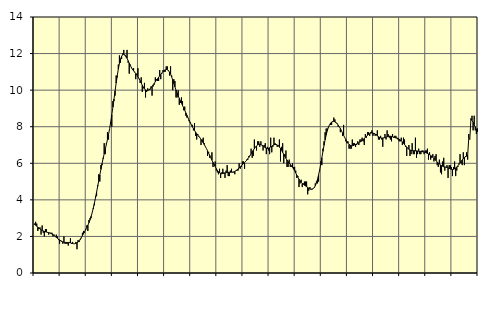
| Category | Piggar | Series 1 |
|---|---|---|
| nan | 2.7 | 2.65 |
| 87.0 | 2.8 | 2.61 |
| 87.0 | 2.7 | 2.56 |
| 87.0 | 2.3 | 2.51 |
| 87.0 | 2.4 | 2.46 |
| 87.0 | 2.5 | 2.41 |
| 87.0 | 2.1 | 2.36 |
| 87.0 | 2.6 | 2.33 |
| 87.0 | 2.2 | 2.3 |
| 87.0 | 2 | 2.27 |
| 87.0 | 2.4 | 2.25 |
| 87.0 | 2.4 | 2.24 |
| nan | 2.2 | 2.22 |
| 88.0 | 2.1 | 2.21 |
| 88.0 | 2.2 | 2.19 |
| 88.0 | 2.2 | 2.16 |
| 88.0 | 2.2 | 2.13 |
| 88.0 | 2 | 2.09 |
| 88.0 | 2.1 | 2.05 |
| 88.0 | 2 | 2 |
| 88.0 | 2.1 | 1.95 |
| 88.0 | 2 | 1.9 |
| 88.0 | 1.8 | 1.85 |
| 88.0 | 1.6 | 1.81 |
| nan | 1.8 | 1.76 |
| 89.0 | 1.7 | 1.73 |
| 89.0 | 1.6 | 1.7 |
| 89.0 | 2 | 1.68 |
| 89.0 | 1.6 | 1.67 |
| 89.0 | 1.6 | 1.67 |
| 89.0 | 1.6 | 1.67 |
| 89.0 | 1.5 | 1.66 |
| 89.0 | 1.7 | 1.66 |
| 89.0 | 1.9 | 1.65 |
| 89.0 | 1.6 | 1.63 |
| 89.0 | 1.7 | 1.61 |
| nan | 1.6 | 1.6 |
| 90.0 | 1.6 | 1.6 |
| 90.0 | 1.7 | 1.62 |
| 90.0 | 1.3 | 1.65 |
| 90.0 | 1.8 | 1.69 |
| 90.0 | 1.7 | 1.76 |
| 90.0 | 1.8 | 1.84 |
| 90.0 | 1.9 | 1.94 |
| 90.0 | 2.2 | 2.04 |
| 90.0 | 2.3 | 2.15 |
| 90.0 | 2.2 | 2.26 |
| 90.0 | 2.4 | 2.37 |
| nan | 2.6 | 2.49 |
| 91.0 | 2.3 | 2.61 |
| 91.0 | 2.9 | 2.75 |
| 91.0 | 3 | 2.91 |
| 91.0 | 3 | 3.1 |
| 91.0 | 3.3 | 3.31 |
| 91.0 | 3.5 | 3.55 |
| 91.0 | 3.7 | 3.82 |
| 91.0 | 4.2 | 4.11 |
| 91.0 | 4.2 | 4.42 |
| 91.0 | 4.8 | 4.73 |
| 91.0 | 5.4 | 5.05 |
| nan | 5 | 5.36 |
| 92.0 | 5.9 | 5.67 |
| 92.0 | 5.9 | 5.97 |
| 92.0 | 6.3 | 6.25 |
| 92.0 | 7.1 | 6.52 |
| 92.0 | 6.5 | 6.77 |
| 92.0 | 7.1 | 7.03 |
| 92.0 | 7.7 | 7.3 |
| 92.0 | 7.3 | 7.58 |
| 92.0 | 7.9 | 7.9 |
| 92.0 | 8.2 | 8.26 |
| 92.0 | 8 | 8.65 |
| nan | 9.4 | 9.07 |
| 93.0 | 9.4 | 9.51 |
| 93.0 | 9.7 | 9.95 |
| 93.0 | 10.8 | 10.39 |
| 93.0 | 10.7 | 10.79 |
| 93.0 | 11.4 | 11.16 |
| 93.0 | 11.9 | 11.46 |
| 93.0 | 11.5 | 11.7 |
| 93.0 | 11.7 | 11.85 |
| 93.0 | 12 | 11.94 |
| 93.0 | 12.2 | 11.96 |
| 93.0 | 11.9 | 11.93 |
| nan | 11.8 | 11.85 |
| 94.0 | 12.2 | 11.74 |
| 94.0 | 11.5 | 11.61 |
| 94.0 | 10.9 | 11.48 |
| 94.0 | 11.4 | 11.35 |
| 94.0 | 11.2 | 11.24 |
| 94.0 | 11.1 | 11.14 |
| 94.0 | 11.2 | 11.06 |
| 94.0 | 11 | 10.98 |
| 94.0 | 10.6 | 10.91 |
| 94.0 | 10.9 | 10.83 |
| 94.0 | 11.2 | 10.74 |
| nan | 10.6 | 10.63 |
| 95.0 | 10.4 | 10.52 |
| 95.0 | 10.7 | 10.39 |
| 95.0 | 9.9 | 10.27 |
| 95.0 | 10.1 | 10.17 |
| 95.0 | 10.4 | 10.08 |
| 95.0 | 9.6 | 10.01 |
| 95.0 | 9.9 | 9.98 |
| 95.0 | 10.1 | 9.98 |
| 95.0 | 10 | 10.01 |
| 95.0 | 10 | 10.06 |
| 95.0 | 10.2 | 10.13 |
| nan | 9.7 | 10.2 |
| 96.0 | 10.2 | 10.29 |
| 96.0 | 10.3 | 10.37 |
| 96.0 | 10.7 | 10.46 |
| 96.0 | 10.6 | 10.54 |
| 96.0 | 10.5 | 10.62 |
| 96.0 | 10.5 | 10.7 |
| 96.0 | 11.1 | 10.78 |
| 96.0 | 10.6 | 10.86 |
| 96.0 | 10.9 | 10.94 |
| 96.0 | 11.1 | 11.01 |
| 96.0 | 11 | 11.07 |
| nan | 11 | 11.11 |
| 97.0 | 11.3 | 11.13 |
| 97.0 | 11.3 | 11.12 |
| 97.0 | 11.1 | 11.07 |
| 97.0 | 10.8 | 10.99 |
| 97.0 | 11.3 | 10.87 |
| 97.0 | 10.8 | 10.72 |
| 97.0 | 10 | 10.55 |
| 97.0 | 10.6 | 10.37 |
| 97.0 | 10.5 | 10.18 |
| 97.0 | 9.6 | 10 |
| 97.0 | 9.6 | 9.84 |
| nan | 10 | 9.69 |
| 98.0 | 9.2 | 9.55 |
| 98.0 | 9.3 | 9.42 |
| 98.0 | 9.6 | 9.29 |
| 98.0 | 9.4 | 9.16 |
| 98.0 | 8.9 | 9.03 |
| 98.0 | 9.1 | 8.9 |
| 98.0 | 8.6 | 8.76 |
| 98.0 | 8.5 | 8.63 |
| 98.0 | 8.5 | 8.49 |
| 98.0 | 8.3 | 8.36 |
| 98.0 | 8.2 | 8.24 |
| nan | 8.1 | 8.12 |
| 99.0 | 8.1 | 8 |
| 99.0 | 7.8 | 7.9 |
| 99.0 | 8.2 | 7.8 |
| 99.0 | 7.5 | 7.7 |
| 99.0 | 7.3 | 7.62 |
| 99.0 | 7.6 | 7.54 |
| 99.0 | 7.5 | 7.46 |
| 99.0 | 7.4 | 7.39 |
| 99.0 | 7 | 7.3 |
| 99.0 | 7.3 | 7.22 |
| 99.0 | 7.4 | 7.12 |
| nan | 7.1 | 7.02 |
| 0.0 | 6.9 | 6.91 |
| 0.0 | 6.8 | 6.8 |
| 0.0 | 6.4 | 6.68 |
| 0.0 | 6.6 | 6.55 |
| 0.0 | 6.3 | 6.43 |
| 0.0 | 6.3 | 6.3 |
| 0.0 | 6.6 | 6.17 |
| 0.0 | 5.8 | 6.05 |
| 0.0 | 5.9 | 5.93 |
| 0.0 | 6.1 | 5.82 |
| 0.0 | 5.6 | 5.71 |
| nan | 5.5 | 5.61 |
| 1.0 | 5.4 | 5.54 |
| 1.0 | 5.7 | 5.48 |
| 1.0 | 5.2 | 5.45 |
| 1.0 | 5.5 | 5.43 |
| 1.0 | 5.7 | 5.44 |
| 1.0 | 5.5 | 5.45 |
| 1.0 | 5.2 | 5.47 |
| 1.0 | 5.6 | 5.48 |
| 1.0 | 5.9 | 5.5 |
| 1.0 | 5.3 | 5.51 |
| 1.0 | 5.3 | 5.51 |
| nan | 5.6 | 5.51 |
| 2.0 | 5.7 | 5.51 |
| 2.0 | 5.5 | 5.52 |
| 2.0 | 5.5 | 5.53 |
| 2.0 | 5.4 | 5.56 |
| 2.0 | 5.6 | 5.59 |
| 2.0 | 5.6 | 5.64 |
| 2.0 | 5.6 | 5.69 |
| 2.0 | 6 | 5.74 |
| 2.0 | 5.7 | 5.8 |
| 2.0 | 5.8 | 5.86 |
| 2.0 | 6.1 | 5.92 |
| nan | 6.1 | 5.98 |
| 3.0 | 5.7 | 6.04 |
| 3.0 | 6.1 | 6.11 |
| 3.0 | 6.2 | 6.17 |
| 3.0 | 6.2 | 6.25 |
| 3.0 | 6.4 | 6.33 |
| 3.0 | 6.4 | 6.42 |
| 3.0 | 6.8 | 6.52 |
| 3.0 | 6.3 | 6.61 |
| 3.0 | 6.4 | 6.71 |
| 3.0 | 7.3 | 6.8 |
| 3.0 | 6.9 | 6.88 |
| nan | 6.7 | 6.95 |
| 4.0 | 7.2 | 7 |
| 4.0 | 7.2 | 7.03 |
| 4.0 | 6.9 | 7.04 |
| 4.0 | 7.2 | 7.02 |
| 4.0 | 7 | 6.99 |
| 4.0 | 6.7 | 6.95 |
| 4.0 | 7 | 6.9 |
| 4.0 | 7.1 | 6.85 |
| 4.0 | 6.5 | 6.83 |
| 4.0 | 6.9 | 6.81 |
| 4.0 | 6.7 | 6.82 |
| nan | 6.5 | 6.85 |
| 5.0 | 7.4 | 6.89 |
| 5.0 | 6.6 | 6.93 |
| 5.0 | 6.9 | 6.98 |
| 5.0 | 7.4 | 7.01 |
| 5.0 | 7.1 | 7.03 |
| 5.0 | 7 | 7.03 |
| 5.0 | 6.9 | 7 |
| 5.0 | 7 | 6.96 |
| 5.0 | 7.3 | 6.89 |
| 5.0 | 6.1 | 6.81 |
| 5.0 | 6.9 | 6.71 |
| nan | 7.1 | 6.6 |
| 6.0 | 6 | 6.49 |
| 6.0 | 6.5 | 6.38 |
| 6.0 | 6.7 | 6.27 |
| 6.0 | 5.8 | 6.18 |
| 6.0 | 5.8 | 6.09 |
| 6.0 | 6.2 | 6.02 |
| 6.0 | 5.8 | 5.94 |
| 6.0 | 5.8 | 5.87 |
| 6.0 | 6 | 5.79 |
| 6.0 | 5.8 | 5.69 |
| 6.0 | 5.8 | 5.59 |
| nan | 5.6 | 5.47 |
| 7.0 | 5.2 | 5.35 |
| 7.0 | 5.3 | 5.24 |
| 7.0 | 4.7 | 5.13 |
| 7.0 | 4.9 | 5.04 |
| 7.0 | 5.1 | 4.96 |
| 7.0 | 4.7 | 4.9 |
| 7.0 | 4.9 | 4.85 |
| 7.0 | 5 | 4.8 |
| 7.0 | 5 | 4.76 |
| 7.0 | 5 | 4.72 |
| 7.0 | 4.3 | 4.68 |
| nan | 4.5 | 4.63 |
| 8.0 | 4.7 | 4.6 |
| 8.0 | 4.6 | 4.58 |
| 8.0 | 4.6 | 4.58 |
| 8.0 | 4.6 | 4.61 |
| 8.0 | 4.7 | 4.67 |
| 8.0 | 4.9 | 4.77 |
| 8.0 | 5 | 4.92 |
| 8.0 | 4.9 | 5.12 |
| 8.0 | 5 | 5.36 |
| 8.0 | 5.6 | 5.64 |
| 8.0 | 6.1 | 5.96 |
| nan | 5.9 | 6.3 |
| 9.0 | 6.8 | 6.65 |
| 9.0 | 7.2 | 6.98 |
| 9.0 | 7.7 | 7.28 |
| 9.0 | 7.9 | 7.55 |
| 9.0 | 7.9 | 7.78 |
| 9.0 | 8 | 7.96 |
| 9.0 | 8.1 | 8.1 |
| 9.0 | 8.1 | 8.19 |
| 9.0 | 8.1 | 8.26 |
| 9.0 | 8.3 | 8.29 |
| 9.0 | 8.5 | 8.29 |
| nan | 8.4 | 8.27 |
| 10.0 | 8.2 | 8.23 |
| 10.0 | 8.2 | 8.17 |
| 10.0 | 8 | 8.09 |
| 10.0 | 8 | 8 |
| 10.0 | 7.7 | 7.9 |
| 10.0 | 7.8 | 7.78 |
| 10.0 | 7.5 | 7.66 |
| 10.0 | 8.1 | 7.53 |
| 10.0 | 7.4 | 7.41 |
| 10.0 | 7.2 | 7.3 |
| 10.0 | 7.1 | 7.19 |
| nan | 7.2 | 7.1 |
| 11.0 | 6.8 | 7.03 |
| 11.0 | 6.8 | 6.99 |
| 11.0 | 6.8 | 6.96 |
| 11.0 | 7.3 | 6.96 |
| 11.0 | 7.1 | 6.97 |
| 11.0 | 7.1 | 7 |
| 11.0 | 6.9 | 7.03 |
| 11.0 | 7 | 7.06 |
| 11.0 | 7.2 | 7.09 |
| 11.0 | 7 | 7.12 |
| 11.0 | 7.3 | 7.16 |
| nan | 7.3 | 7.2 |
| 12.0 | 7.4 | 7.24 |
| 12.0 | 7.2 | 7.3 |
| 12.0 | 7 | 7.36 |
| 12.0 | 7.6 | 7.42 |
| 12.0 | 7.4 | 7.48 |
| 12.0 | 7.7 | 7.54 |
| 12.0 | 7.7 | 7.58 |
| 12.0 | 7.5 | 7.62 |
| 12.0 | 7.7 | 7.65 |
| 12.0 | 7.8 | 7.66 |
| 12.0 | 7.5 | 7.65 |
| nan | 7.6 | 7.63 |
| 13.0 | 7.5 | 7.6 |
| 13.0 | 7.6 | 7.55 |
| 13.0 | 7.8 | 7.5 |
| 13.0 | 7.3 | 7.46 |
| 13.0 | 7.3 | 7.42 |
| 13.0 | 7.5 | 7.39 |
| 13.0 | 7.3 | 7.38 |
| 13.0 | 6.9 | 7.38 |
| 13.0 | 7.4 | 7.39 |
| 13.0 | 7.6 | 7.41 |
| 13.0 | 7.3 | 7.43 |
| nan | 7.8 | 7.45 |
| 14.0 | 7.6 | 7.46 |
| 14.0 | 7.4 | 7.48 |
| 14.0 | 7.3 | 7.48 |
| 14.0 | 7.2 | 7.47 |
| 14.0 | 7.6 | 7.45 |
| 14.0 | 7.4 | 7.43 |
| 14.0 | 7.5 | 7.41 |
| 14.0 | 7.5 | 7.39 |
| 14.0 | 7.4 | 7.37 |
| 14.0 | 7.3 | 7.35 |
| 14.0 | 7.2 | 7.32 |
| nan | 7.2 | 7.28 |
| 15.0 | 7.4 | 7.23 |
| 15.0 | 7 | 7.17 |
| 15.0 | 7.4 | 7.1 |
| 15.0 | 7.3 | 7.02 |
| 15.0 | 6.9 | 6.95 |
| 15.0 | 6.4 | 6.88 |
| 15.0 | 6.8 | 6.82 |
| 15.0 | 7 | 6.77 |
| 15.0 | 6.4 | 6.73 |
| 15.0 | 6.5 | 6.7 |
| 15.0 | 7.1 | 6.69 |
| nan | 6.5 | 6.69 |
| 16.0 | 6.5 | 6.69 |
| 16.0 | 7.4 | 6.68 |
| 16.0 | 6.3 | 6.68 |
| 16.0 | 6.5 | 6.67 |
| 16.0 | 6.8 | 6.66 |
| 16.0 | 6.5 | 6.65 |
| 16.0 | 6.5 | 6.65 |
| 16.0 | 6.7 | 6.64 |
| 16.0 | 6.7 | 6.63 |
| 16.0 | 6.5 | 6.62 |
| 16.0 | 6.7 | 6.6 |
| nan | 6.7 | 6.57 |
| 17.0 | 6.8 | 6.54 |
| 17.0 | 6.2 | 6.51 |
| 17.0 | 6.6 | 6.47 |
| 17.0 | 6.2 | 6.43 |
| 17.0 | 6.3 | 6.39 |
| 17.0 | 6.5 | 6.33 |
| 17.0 | 6.1 | 6.27 |
| 17.0 | 6.4 | 6.2 |
| 17.0 | 6.5 | 6.14 |
| 17.0 | 5.9 | 6.07 |
| 17.0 | 5.8 | 6.01 |
| nan | 6.2 | 5.96 |
| 18.0 | 5.5 | 5.91 |
| 18.0 | 5.4 | 5.87 |
| 18.0 | 6.1 | 5.84 |
| 18.0 | 6.3 | 5.81 |
| 18.0 | 5.6 | 5.8 |
| 18.0 | 5.8 | 5.79 |
| 18.0 | 5.9 | 5.77 |
| 18.0 | 5.2 | 5.75 |
| 18.0 | 5.9 | 5.72 |
| 18.0 | 5.9 | 5.69 |
| 18.0 | 5.8 | 5.67 |
| nan | 5.3 | 5.66 |
| 19.0 | 5.8 | 5.67 |
| 19.0 | 6.1 | 5.7 |
| 19.0 | 5.3 | 5.74 |
| 19.0 | 5.6 | 5.8 |
| 19.0 | 5.8 | 5.86 |
| 19.0 | 6 | 5.94 |
| 19.0 | 6.5 | 6.02 |
| 19.0 | 6 | 6.1 |
| 19.0 | 5.9 | 6.18 |
| 19.0 | 6.6 | 6.26 |
| 19.0 | 5.9 | 6.32 |
| nan | 6.4 | 6.36 |
| 20.0 | 6.6 | 6.39 |
| 20.0 | 6.2 | 6.44 |
| 20.0 | 7.6 | 7.38 |
| 20.0 | 7.3 | 7.33 |
| 20.0 | 8.4 | 8.44 |
| 20.0 | 8.6 | 8.34 |
| 20.0 | 7.8 | 8.23 |
| 20.0 | 8.6 | 8.11 |
| 20.0 | 7.8 | 7.98 |
| 20.0 | 7.6 | 7.85 |
| 20.0 | 7.9 | 7.73 |